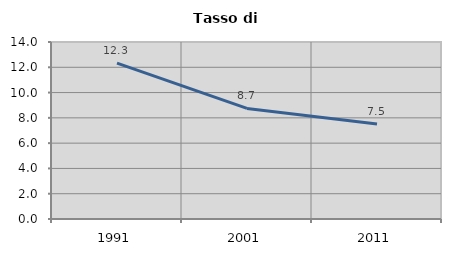
| Category | Tasso di disoccupazione   |
|---|---|
| 1991.0 | 12.325 |
| 2001.0 | 8.744 |
| 2011.0 | 7.518 |